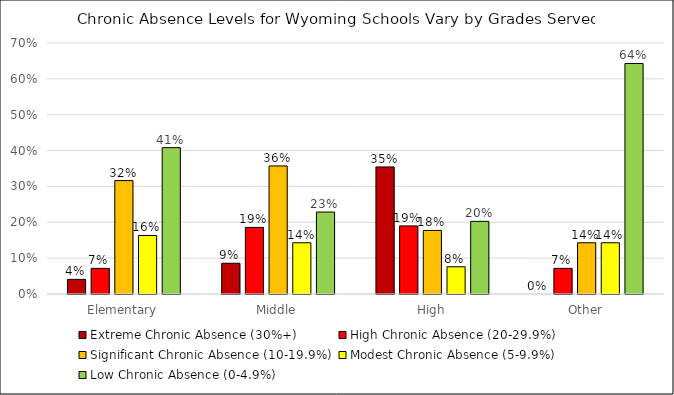
| Category | Extreme Chronic Absence (30%+) | High Chronic Absence (20-29.9%) | Significant Chronic Absence (10-19.9%) | Modest Chronic Absence (5-9.9%) | Low Chronic Absence (0-4.9%) |
|---|---|---|---|---|---|
| Elementary | 0.041 | 0.071 | 0.316 | 0.163 | 0.408 |
| Middle | 0.086 | 0.186 | 0.357 | 0.143 | 0.229 |
| High | 0.354 | 0.19 | 0.177 | 0.076 | 0.203 |
| Other | 0 | 0.071 | 0.143 | 0.143 | 0.643 |